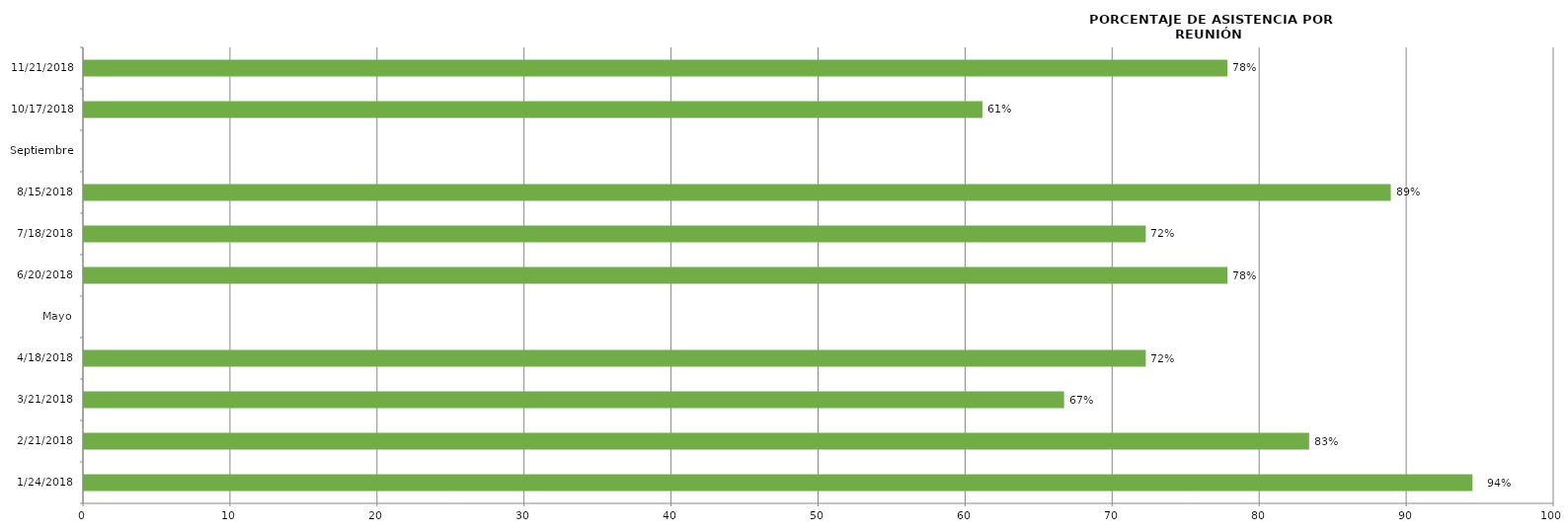
| Category | Series 0 |
|---|---|
| 24/01/2018 | 94.444 |
| 21/02/2018 | 83.333 |
| 21/03/2018 | 66.667 |
| 18/04/2018 | 72.222 |
| Mayo | 0 |
| 20/06/2018 | 77.778 |
| 18/07/2018 | 72.222 |
| 15/08/2018 | 88.889 |
| Septiembre | 0 |
| 17/10/2018 | 61.111 |
| 21/11/2018 | 77.778 |